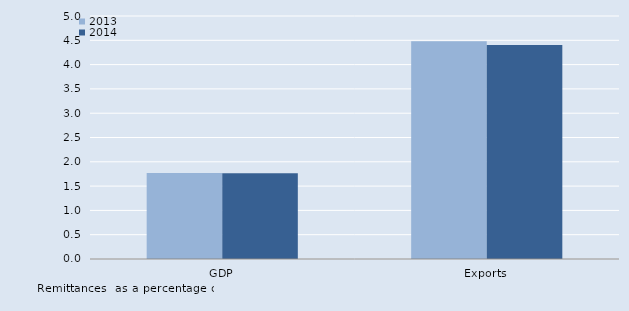
| Category | 2013 | 2014 |
|---|---|---|
| GDP | 1.771 | 1.763 |
| Exports | 4.482 | 4.402 |